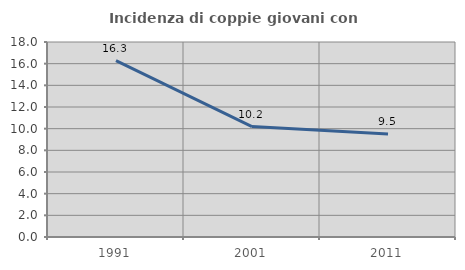
| Category | Incidenza di coppie giovani con figli |
|---|---|
| 1991.0 | 16.275 |
| 2001.0 | 10.197 |
| 2011.0 | 9.515 |